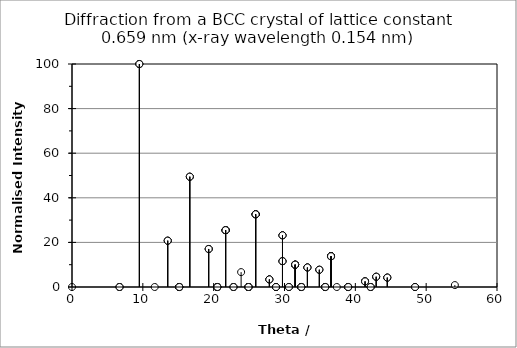
| Category | Series 0 |
|---|---|
| 0.0 | 0 |
| 6.709978439712354 | 0 |
| 13.514262431824092 | 20.777 |
| 20.519803470332043 | 0 |
| 27.86402428486989 | 3.404 |
| 6.709978439712354 | 0 |
| 9.511290053946226 | 100 |
| 15.145460202029952 | 0 |
| 21.684305231007333 | 25.484 |
| 28.800343479869195 | 0 |
| 13.514262431824092 | 20.777 |
| 15.145460202029952 | 0 |
| 19.29814873694832 | 17.053 |
| 24.9158022249994 | 0 |
| 31.502846466912494 | 10.017 |
| 20.519803470332043 | 0 |
| 21.684305231007333 | 25.484 |
| 24.9158022249994 | 0 |
| 29.717624878165697 | 11.59 |
| 35.747800698581095 | 0 |
| 27.86402428486989 | 3.404 |
| 28.800343479869195 | 0 |
| 31.502846466912494 | 10.017 |
| 35.747800698581095 | 0 |
| 41.37372420182965 | 2.534 |
| 6.709978439712354 | 0 |
| 9.511290053946226 | 100 |
| 15.145460202029952 | 0 |
| 21.684305231007333 | 25.484 |
| 28.800343479869195 | 0 |
| 9.511290053946226 | 100 |
| 11.676124485655766 | 0 |
| 16.631037253855045 | 49.469 |
| 22.80069201131791 | 0 |
| 29.717624878165697 | 23.181 |
| 15.145460202029952 | 0 |
| 16.631037253855045 | 49.469 |
| 20.519803470332043 | 0 |
| 25.92467190762787 | 32.612 |
| 32.374102817569934 | 0 |
| 21.684305231007333 | 25.484 |
| 22.80069201131791 | 0 |
| 25.92467190762787 | 32.612 |
| 30.61787290448273 | 0 |
| 36.56885003201428 | 13.8 |
| 28.800343479869195 | 0 |
| 29.717624878165697 | 23.181 |
| 32.374102817569934 | 0 |
| 36.56885003201428 | 13.8 |
| 42.160983402125304 | 0 |
| 13.514262431824092 | 20.777 |
| 15.145460202029952 | 0 |
| 19.29814873694832 | 17.053 |
| 24.9158022249994 | 0 |
| 31.502846466912494 | 10.017 |
| 15.145460202029952 | 0 |
| 16.631037253855045 | 49.469 |
| 20.519803470332043 | 0 |
| 25.92467190762787 | 32.612 |
| 32.374102817569934 | 0 |
| 19.29814873694832 | 17.053 |
| 20.519803470332043 | 0 |
| 23.875991815516066 | 6.677 |
| 28.800343479869195 | 0 |
| 34.918796472883564 | 7.744 |
| 24.9158022249994 | 0 |
| 25.92467190762787 | 32.612 |
| 28.800343479869195 | 0 |
| 33.23303217556015 | 8.764 |
| 38.99279027122686 | 0 |
| 31.502846466912494 | 10.017 |
| 32.374102817569934 | 0 |
| 34.918796472883564 | 7.744 |
| 38.99279027122686 | 0 |
| 44.51228794264627 | 4.221 |
| 20.519803470332043 | 0 |
| 21.684305231007333 | 25.484 |
| 24.9158022249994 | 0 |
| 29.717624878165697 | 11.59 |
| 35.747800698581095 | 0 |
| 21.684305231007333 | 25.484 |
| 22.80069201131791 | 0 |
| 25.92467190762787 | 32.612 |
| 30.61787290448273 | 0 |
| 36.56885003201428 | 13.8 |
| 24.9158022249994 | 0 |
| 25.92467190762787 | 32.612 |
| 28.800343479869195 | 0 |
| 33.23303217556015 | 8.764 |
| 38.99279027122686 | 0 |
| 29.717624878165697 | 11.59 |
| 30.61787290448273 | 0 |
| 33.23303217556015 | 8.764 |
| 37.38282570397467 | 0 |
| 42.94609677060287 | 4.617 |
| 35.747800698581095 | 0 |
| 36.56885003201428 | 13.8 |
| 38.99279027122686 | 0 |
| 42.94609677060287 | 4.617 |
| 48.431651462574685 | 0 |
| 27.86402428486989 | 3.404 |
| 28.800343479869195 | 0 |
| 31.502846466912494 | 10.017 |
| 35.747800698581095 | 0 |
| 41.37372420182965 | 2.534 |
| 28.800343479869195 | 0 |
| 29.717624878165697 | 23.181 |
| 32.374102817569934 | 0 |
| 36.56885003201428 | 13.8 |
| 42.160983402125304 | 0 |
| 31.502846466912494 | 10.017 |
| 32.374102817569934 | 0 |
| 34.918796472883564 | 7.744 |
| 38.99279027122686 | 0 |
| 44.51228794264627 | 4.221 |
| 35.747800698581095 | 0 |
| 36.56885003201428 | 13.8 |
| 38.99279027122686 | 0 |
| 42.94609677060287 | 4.617 |
| 48.431651462574685 | 0 |
| 41.37372420182965 | 2.534 |
| 42.160983402125304 | 0 |
| 44.51228794264627 | 4.221 |
| 48.431651462574685 | 0 |
| 54.04875978489639 | 0.866 |